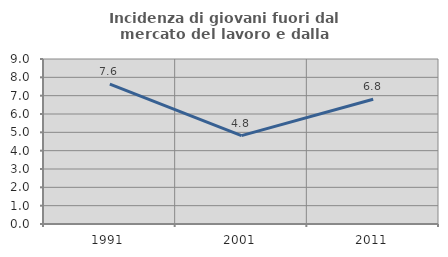
| Category | Incidenza di giovani fuori dal mercato del lavoro e dalla formazione  |
|---|---|
| 1991.0 | 7.629 |
| 2001.0 | 4.819 |
| 2011.0 | 6.803 |